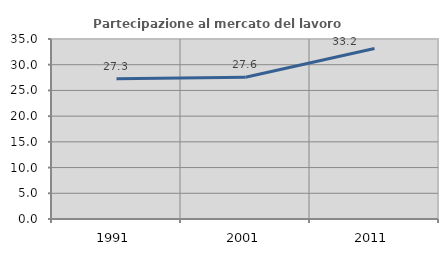
| Category | Partecipazione al mercato del lavoro  femminile |
|---|---|
| 1991.0 | 27.255 |
| 2001.0 | 27.568 |
| 2011.0 | 33.151 |